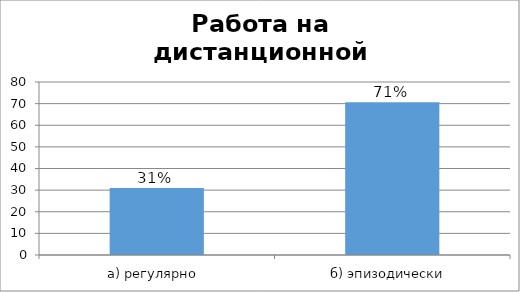
| Category | Series 0 |
|---|---|
| а) регулярно  | 30.928 |
| б) эпизодически  | 70.619 |